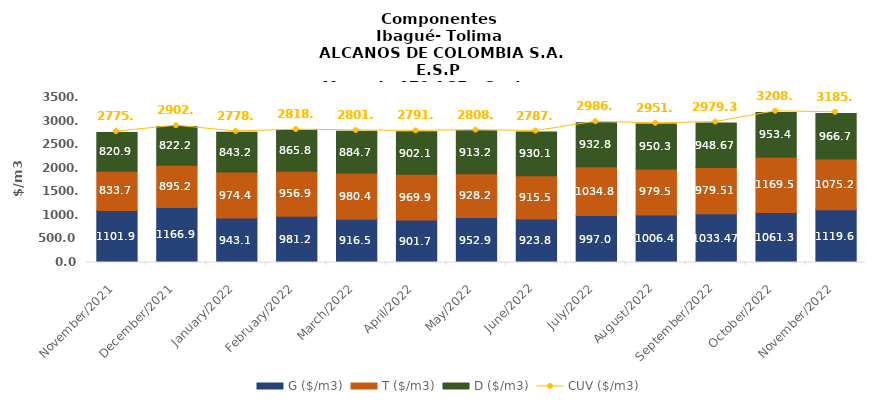
| Category | G ($/m3) | T ($/m3) | D ($/m3) |
|---|---|---|---|
| 2021-11-01 | 1101.92 | 833.69 | 820.85 |
| 2021-12-01 | 1166.9 | 895.22 | 822.17 |
| 2022-01-01 | 943.11 | 974.42 | 843.23 |
| 2022-02-01 | 981.24 | 956.88 | 865.81 |
| 2022-03-01 | 916.5 | 980.4 | 884.73 |
| 2022-04-01 | 901.73 | 969.87 | 902.09 |
| 2022-05-01 | 952.91 | 928.23 | 913.22 |
| 2022-06-01 | 923.8 | 915.47 | 930.11 |
| 2022-07-01 | 996.95 | 1034.77 | 932.75 |
| 2022-08-01 | 1006.44 | 979.53 | 950.32 |
| 2022-09-01 | 1033.47 | 979.51 | 948.67 |
| 2022-10-01 | 1061.27 | 1169.53 | 953.42 |
| 2022-11-01 | 1119.61 | 1075.19 | 966.69 |